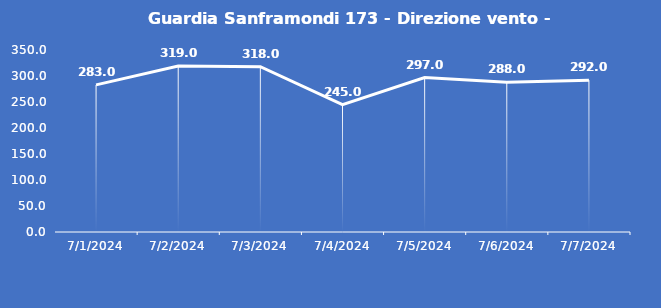
| Category | Guardia Sanframondi 173 - Direzione vento - Grezzo (°N) |
|---|---|
| 7/1/24 | 283 |
| 7/2/24 | 319 |
| 7/3/24 | 318 |
| 7/4/24 | 245 |
| 7/5/24 | 297 |
| 7/6/24 | 288 |
| 7/7/24 | 292 |